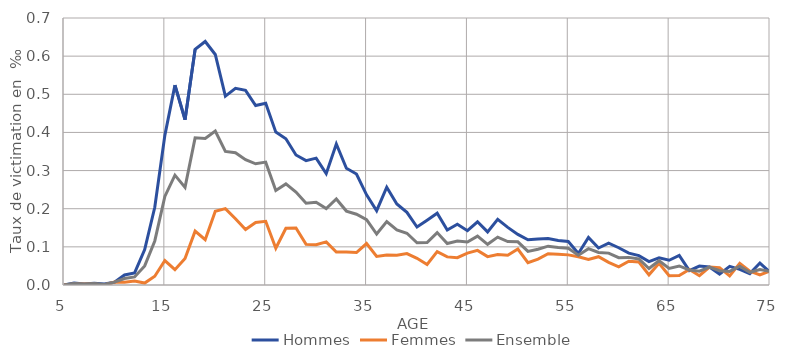
| Category | Hommes | Femmes | Ensemble |
|---|---|---|---|
| 5.0 | 0 | 0 | 0 |
| 6.0 | 0.005 | 0.003 | 0.004 |
| 7.0 | 0.002 | 0.002 | 0.002 |
| 8.0 | 0.005 | 0.002 | 0.004 |
| 9.0 | 0.002 | 0 | 0.001 |
| 10.0 | 0.007 | 0.008 | 0.007 |
| 11.0 | 0.026 | 0.008 | 0.017 |
| 12.0 | 0.032 | 0.01 | 0.021 |
| 13.0 | 0.093 | 0.005 | 0.05 |
| 14.0 | 0.204 | 0.023 | 0.116 |
| 15.0 | 0.392 | 0.064 | 0.232 |
| 16.0 | 0.524 | 0.04 | 0.288 |
| 17.0 | 0.433 | 0.069 | 0.256 |
| 18.0 | 0.618 | 0.141 | 0.386 |
| 19.0 | 0.638 | 0.119 | 0.384 |
| 20.0 | 0.604 | 0.193 | 0.404 |
| 21.0 | 0.495 | 0.2 | 0.35 |
| 22.0 | 0.516 | 0.174 | 0.347 |
| 23.0 | 0.51 | 0.145 | 0.329 |
| 24.0 | 0.47 | 0.164 | 0.318 |
| 25.0 | 0.476 | 0.167 | 0.322 |
| 26.0 | 0.401 | 0.096 | 0.248 |
| 27.0 | 0.383 | 0.149 | 0.265 |
| 28.0 | 0.341 | 0.15 | 0.244 |
| 29.0 | 0.326 | 0.106 | 0.214 |
| 30.0 | 0.333 | 0.106 | 0.217 |
| 31.0 | 0.292 | 0.113 | 0.2 |
| 32.0 | 0.37 | 0.086 | 0.225 |
| 33.0 | 0.306 | 0.087 | 0.194 |
| 34.0 | 0.291 | 0.085 | 0.186 |
| 35.0 | 0.236 | 0.109 | 0.171 |
| 36.0 | 0.195 | 0.075 | 0.134 |
| 37.0 | 0.256 | 0.079 | 0.166 |
| 38.0 | 0.213 | 0.078 | 0.144 |
| 39.0 | 0.19 | 0.082 | 0.136 |
| 40.0 | 0.152 | 0.07 | 0.111 |
| 41.0 | 0.17 | 0.054 | 0.111 |
| 42.0 | 0.188 | 0.088 | 0.137 |
| 43.0 | 0.144 | 0.074 | 0.109 |
| 44.0 | 0.159 | 0.072 | 0.115 |
| 45.0 | 0.142 | 0.084 | 0.113 |
| 46.0 | 0.166 | 0.091 | 0.128 |
| 47.0 | 0.139 | 0.074 | 0.107 |
| 48.0 | 0.172 | 0.08 | 0.126 |
| 49.0 | 0.151 | 0.078 | 0.114 |
| 50.0 | 0.133 | 0.094 | 0.113 |
| 51.0 | 0.118 | 0.059 | 0.088 |
| 52.0 | 0.12 | 0.068 | 0.094 |
| 53.0 | 0.122 | 0.082 | 0.102 |
| 54.0 | 0.117 | 0.081 | 0.098 |
| 55.0 | 0.114 | 0.079 | 0.096 |
| 56.0 | 0.082 | 0.074 | 0.078 |
| 57.0 | 0.125 | 0.067 | 0.095 |
| 58.0 | 0.097 | 0.074 | 0.085 |
| 59.0 | 0.11 | 0.059 | 0.084 |
| 60.0 | 0.098 | 0.048 | 0.072 |
| 61.0 | 0.083 | 0.062 | 0.072 |
| 62.0 | 0.077 | 0.06 | 0.068 |
| 63.0 | 0.061 | 0.027 | 0.043 |
| 64.0 | 0.071 | 0.057 | 0.064 |
| 65.0 | 0.065 | 0.024 | 0.044 |
| 66.0 | 0.078 | 0.025 | 0.05 |
| 67.0 | 0.038 | 0.041 | 0.039 |
| 68.0 | 0.05 | 0.024 | 0.036 |
| 69.0 | 0.047 | 0.047 | 0.047 |
| 70.0 | 0.029 | 0.045 | 0.038 |
| 71.0 | 0.049 | 0.024 | 0.036 |
| 72.0 | 0.041 | 0.057 | 0.049 |
| 73.0 | 0.03 | 0.036 | 0.033 |
| 74.0 | 0.058 | 0.026 | 0.04 |
| 75.0 | 0.034 | 0.037 | 0.035 |